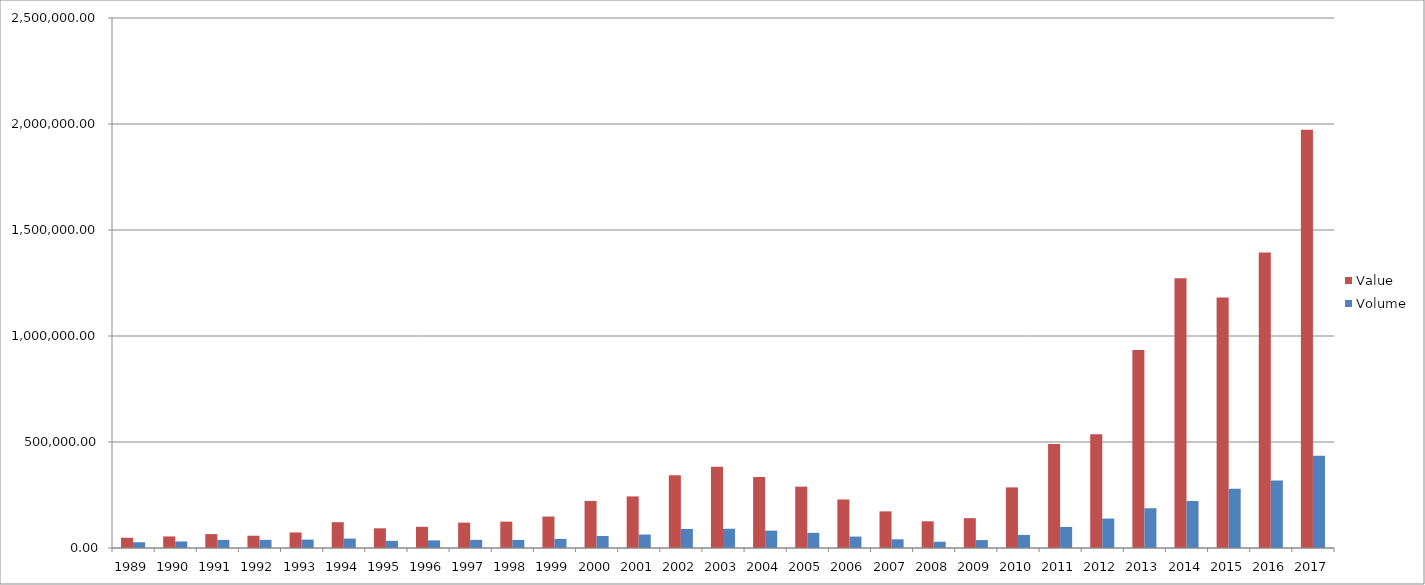
| Category | Value | Volume |
|---|---|---|
| 1989.0 | 48437.397 | 27107 |
| 1990.0 | 54574.391 | 30926 |
| 1991.0 | 65621.734 | 38168 |
| 1992.0 | 57948.512 | 38579 |
| 1993.0 | 73401.531 | 39594 |
| 1994.0 | 121746.965 | 44479 |
| 1995.0 | 92833.912 | 33631 |
| 1996.0 | 100029.333 | 35967 |
| 1997.0 | 119748.644 | 38414 |
| 1998.0 | 124396.033 | 38058 |
| 1999.0 | 148283.342 | 43056 |
| 2000.0 | 222157.787 | 56695 |
| 2001.0 | 243417.131 | 63585 |
| 2002.0 | 343453.68 | 89889 |
| 2003.0 | 382868.998 | 90775 |
| 2004.0 | 335414.062 | 81928 |
| 2005.0 | 289451.559 | 71530 |
| 2006.0 | 228894.844 | 53937 |
| 2007.0 | 172851.365 | 40969 |
| 2008.0 | 125897.421 | 29657 |
| 2009.0 | 140787.769 | 37325 |
| 2010.0 | 285784.71 | 61542 |
| 2011.0 | 490251.93 | 99264 |
| 2012.0 | 536379.65 | 138732 |
| 2013.0 | 934336.541 | 187586 |
| 2014.0 | 1272195.981 | 221857 |
| 2015.0 | 1181472.865 | 279449 |
| 2016.0 | 1393516.796 | 318699 |
| 2017.0 | 1972320.361 | 434559 |